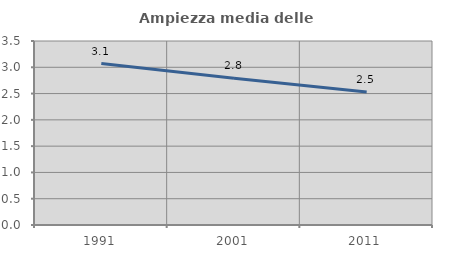
| Category | Ampiezza media delle famiglie |
|---|---|
| 1991.0 | 3.071 |
| 2001.0 | 2.79 |
| 2011.0 | 2.531 |